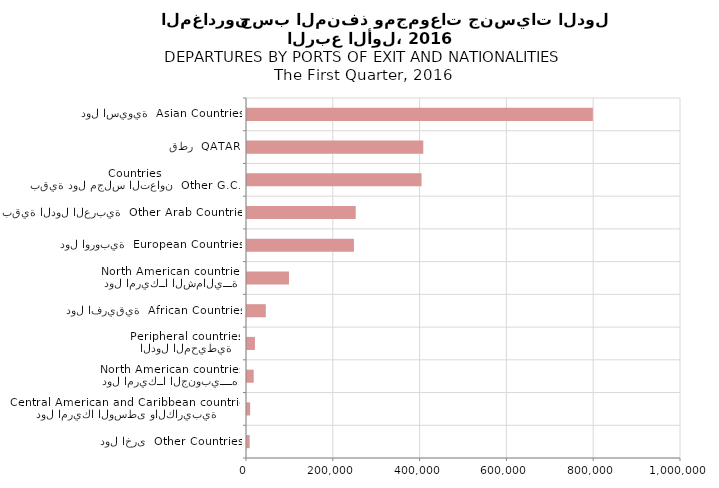
| Category | Series 0 |
|---|---|
| دول اخرى  Other Countries | 6159 |
| دول امريكا الوسطى والكاريبية
Central American and Caribbean countries | 7279 |
| دول امريكــا الجنوبيــــه
North American countries | 15488 |
| الدول المحيطية
Peripheral countries | 18282 |
| دول افريقية  African Countries | 43324 |
| دول امريكــا الشماليـــة
North American countries | 96738 |
| دول اوروبية  European Countries | 246426 |
| بقية الدول العربية  Other Arab Countries | 250533 |
| بقية دول مجلس التعاون  Other G.C.C Countries | 402213 |
| قطر  QATAR | 406209 |
| دول اسيوية  Asian Countries | 796876 |